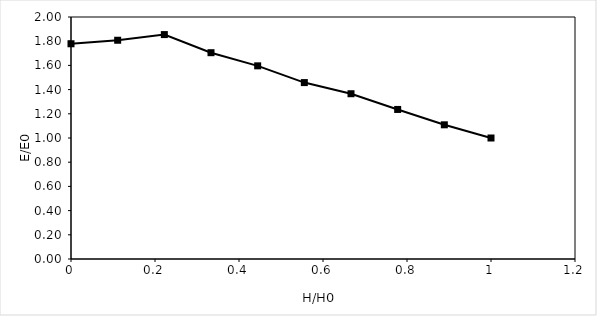
| Category | Head (feet) |
|---|---|
| 1.0 | 1 |
| 0.8888888888888888 | 1.109 |
| 0.7777777777777778 | 1.236 |
| 0.6666666666666666 | 1.366 |
| 0.5555555555555556 | 1.458 |
| 0.4444444444444444 | 1.596 |
| 0.3333333333333333 | 1.705 |
| 0.2222222222222222 | 1.855 |
| 0.1111111111111111 | 1.808 |
| 0.0 | 1.779 |